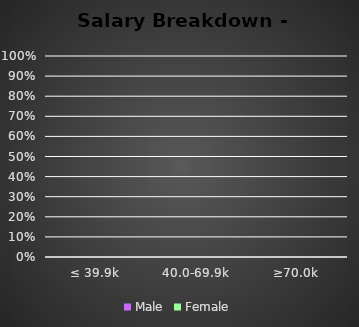
| Category | Male | Female |
|---|---|---|
| ≤ 39.9k | 0 | 0 |
| 40.0-69.9k | 0 | 0 |
| ≥70.0k | 0 | 0 |